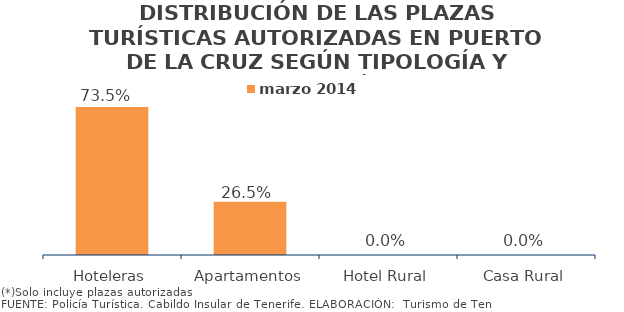
| Category | marzo 2014 |
|---|---|
| Hoteleras | 0.735 |
| Apartamentos | 0.265 |
| Hotel Rural | 0 |
| Casa Rural | 0 |